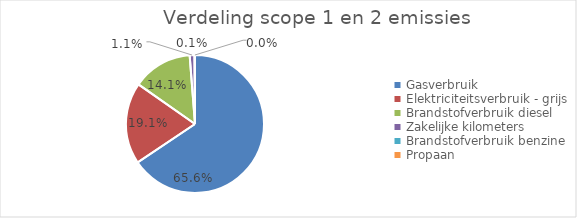
| Category | categorie |
|---|---|
| Gasverbruik | 979.39 |
| Elektriciteitsverbruik - grijs | 285.62 |
| Brandstofverbruik diesel | 209.596 |
| Zakelijke kilometers | 16.787 |
| Brandstofverbruik benzine | 1.26 |
| Propaan | 0.436 |